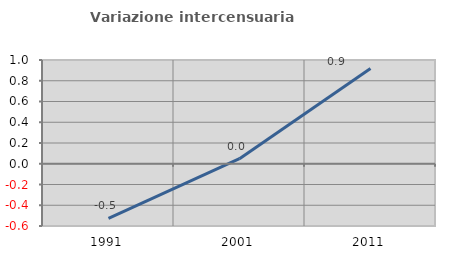
| Category | Variazione intercensuaria annua |
|---|---|
| 1991.0 | -0.526 |
| 2001.0 | 0.049 |
| 2011.0 | 0.917 |